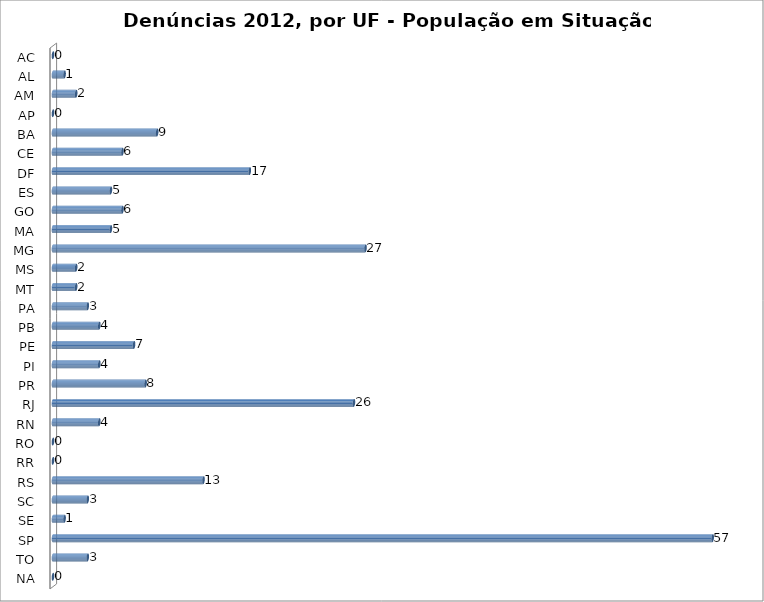
| Category | Series 0 |
|---|---|
| AC | 0 |
| AL | 1 |
| AM | 2 |
| AP | 0 |
| BA | 9 |
| CE | 6 |
| DF | 17 |
| ES | 5 |
| GO | 6 |
| MA | 5 |
| MG | 27 |
| MS | 2 |
| MT | 2 |
| PA | 3 |
| PB | 4 |
| PE | 7 |
| PI | 4 |
| PR | 8 |
| RJ | 26 |
| RN | 4 |
| RO | 0 |
| RR | 0 |
| RS | 13 |
| SC | 3 |
| SE | 1 |
| SP | 57 |
| TO | 3 |
| NA | 0 |